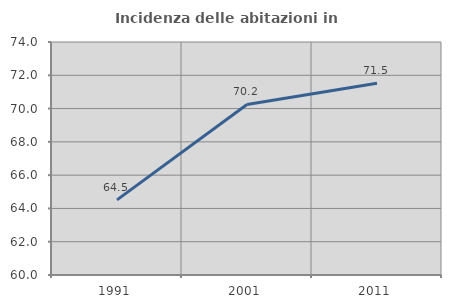
| Category | Incidenza delle abitazioni in proprietà  |
|---|---|
| 1991.0 | 64.513 |
| 2001.0 | 70.247 |
| 2011.0 | 71.525 |